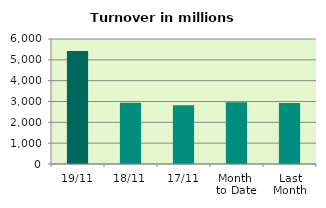
| Category | Series 0 |
|---|---|
| 19/11 | 5426.162 |
| 18/11 | 2941.361 |
| 17/11 | 2823.015 |
| Month 
to Date | 2962.026 |
| Last
Month | 2924.951 |